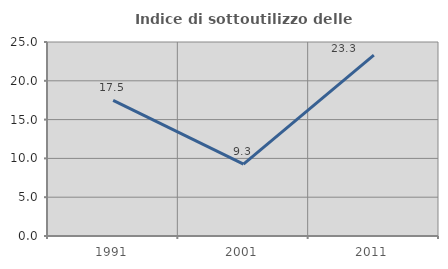
| Category | Indice di sottoutilizzo delle abitazioni  |
|---|---|
| 1991.0 | 17.476 |
| 2001.0 | 9.259 |
| 2011.0 | 23.301 |